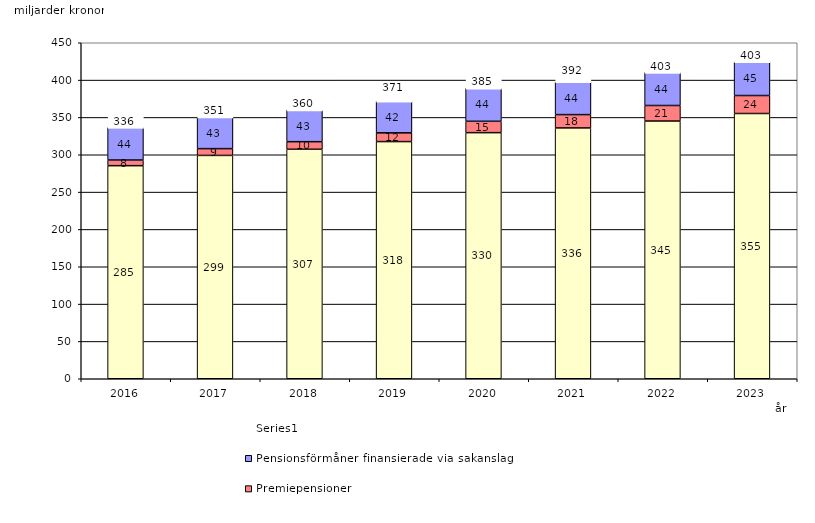
| Category | Inkomstpension och tilläggspension m.m. | Premiepensioner | Pensionsförmåner finansierade via sakanslag | Series 0 |
|---|---|---|---|---|
| 2016.0 | 285.357 | 7.598 | 43.541 | 20 |
| 2017.0 | 299.103 | 9.081 | 42.508 | 20 |
| 2018.0 | 307.356 | 10.141 | 42.538 | 20 |
| 2019.0 | 317.627 | 11.715 | 42.209 | 20 |
| 2020.0 | 329.602 | 15.203 | 44.336 | 20 |
| 2021.0 | 335.926 | 17.844 | 44.057 | 20 |
| 2022.0 | 345.145 | 20.826 | 44.336 | 20 |
| 2023.0 | 355.245 | 24.075 | 45.144 | 20 |